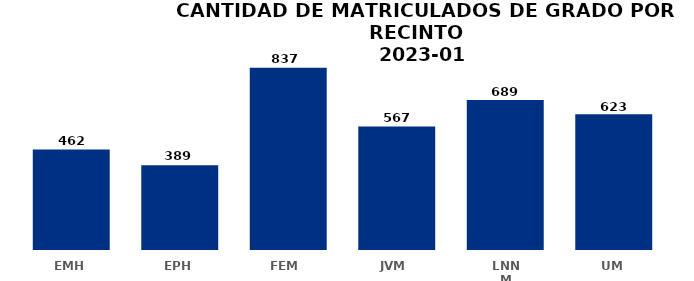
| Category | Series 0 |
|---|---|
| EMH | 462 |
| EPH | 389 |
| FEM  | 837 |
| JVM  | 567 |
| LNNM | 689 |
| UM | 623 |